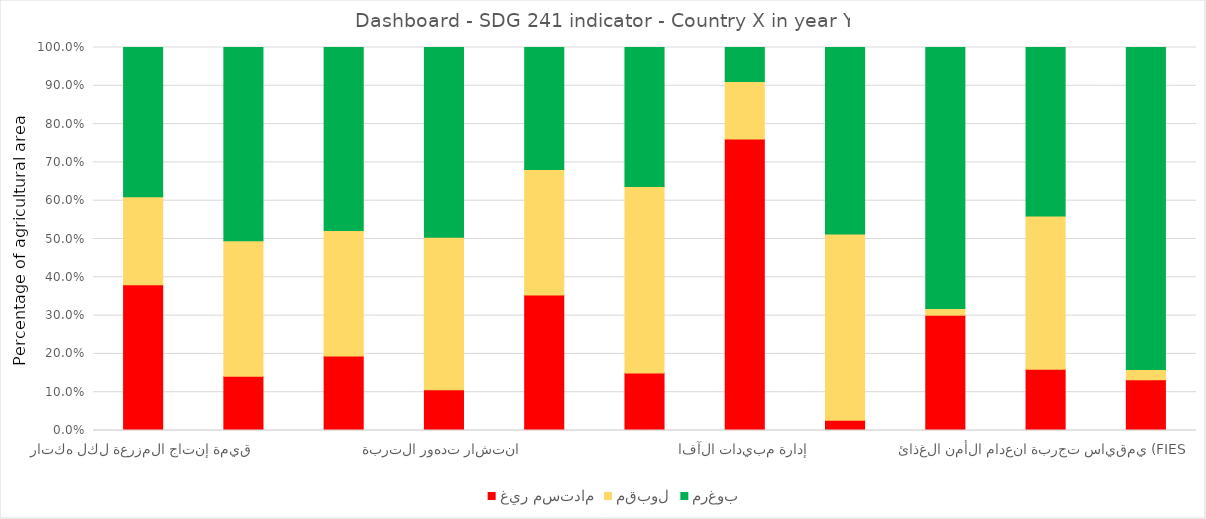
| Category | غير مستدام | مقبول | مرغوب |
|---|---|---|---|
| قيمة إنتاج المزرعة لكل هكتار | 0.381 | 0.23 | 0.389 |
| صافي دخل المزرعة | 0.142 | 0.354 | 0.504 |
| آليات التخفيف من المخاطر | 0.195 | 0.327 | 0.478 |
| انتشار تدهور التربة | 0.106 | 0.398 | 0.496 |
| التباين في توفر المياه | 0.354 | 0.327 | 0.319 |
| إدارة الأسمدة | 0.15 | 0.487 | 0.363 |
| إدارة مبيدات الآفات | 0.761 | 0.15 | 0.088 |
| استخدام الممارسات الداعمة للتنوع البيولوجي الزراعي | 0.027 | 0.487 | 0.487 |
| معدل الأجور في الزراعة | 0.301 | 0.018 | 0.681 |
| مقياس تجربة انعدام الأمن الغذائي (FIES) | 0.16 | 0.4 | 0.44 |
| ضمان حقوق حيازة الأرض | 0.133 | 0.027 | 0.841 |